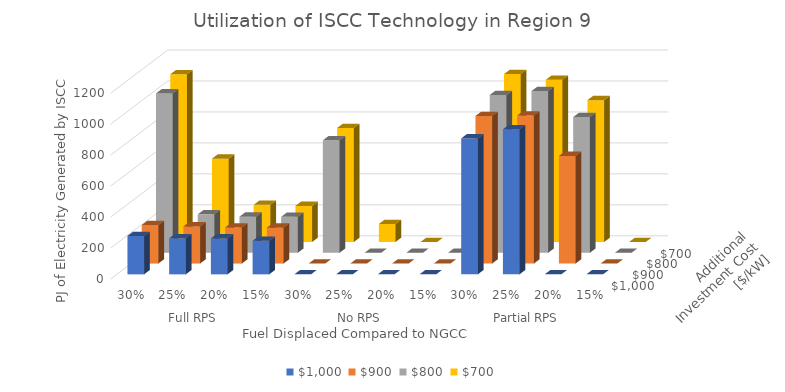
| Category | $1,000  | $900  | $800  | $700  |
|---|---|---|---|---|
| 0 | 248 | 249 | 1029 | 1083 |
| 1 | 233 | 240 | 248 | 538 |
| 2 | 232 | 233 | 233 | 240 |
| 3 | 217 | 232 | 232 | 233 |
| 4 | 0 | 0 | 726 | 736 |
| 5 | 0 | 0 | 0 | 116 |
| 6 | 0 | 0 | 0 | 0 |
| 7 | 0 | 0 | 0 | 0 |
| 8 | 878 | 953 | 1019 | 1084 |
| 9 | 937 | 956 | 1044 | 1047 |
| 10 | 0 | 695 | 876 | 916 |
| 11 | 0 | 0 | 0 | 0 |